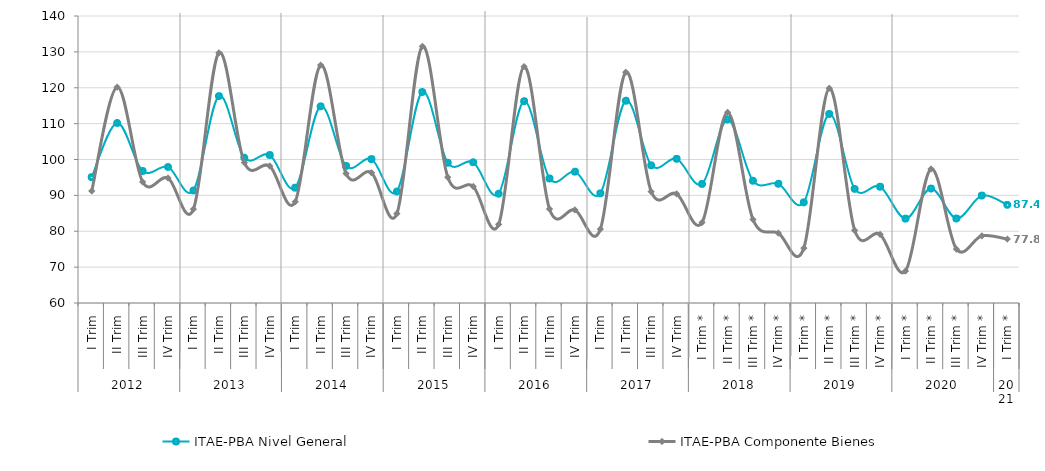
| Category | ITAE-PBA Nivel General | ITAE-PBA Componente Bienes |
|---|---|---|
| 0 | 95.089 | 91.213 |
| 1 | 110.192 | 120.181 |
| 2 | 96.803 | 93.775 |
| 3 | 97.916 | 94.832 |
| 4 | 91.378 | 86.164 |
| 5 | 117.669 | 129.743 |
| 6 | 100.518 | 99.117 |
| 7 | 101.252 | 98.162 |
| 8 | 92.143 | 88.212 |
| 9 | 114.82 | 126.289 |
| 10 | 98.199 | 96.075 |
| 11 | 100.119 | 96.329 |
| 12 | 91.095 | 84.924 |
| 13 | 118.811 | 131.527 |
| 14 | 99.079 | 95.075 |
| 15 | 99.236 | 92.483 |
| 16 | 90.468 | 81.886 |
| 17 | 116.254 | 125.906 |
| 18 | 94.71 | 86.192 |
| 19 | 96.608 | 85.947 |
| 20 | 90.565 | 80.59 |
| 21 | 116.386 | 124.336 |
| 22 | 98.389 | 91.043 |
| 23 | 100.175 | 90.423 |
| 24 | 93.191 | 82.44 |
| 25 | 111.161 | 113.133 |
| 26 | 94.084 | 83.283 |
| 27 | 93.234 | 79.47 |
| 28 | 88.057 | 75.308 |
| 29 | 112.685 | 119.828 |
| 30 | 91.807 | 80.253 |
| 31 | 92.416 | 79.123 |
| 32 | 83.519 | 68.909 |
| 33 | 91.898 | 97.372 |
| 34 | 83.554 | 75.032 |
| 35 | 89.95 | 78.717 |
| 36 | 87.355 | 77.814 |